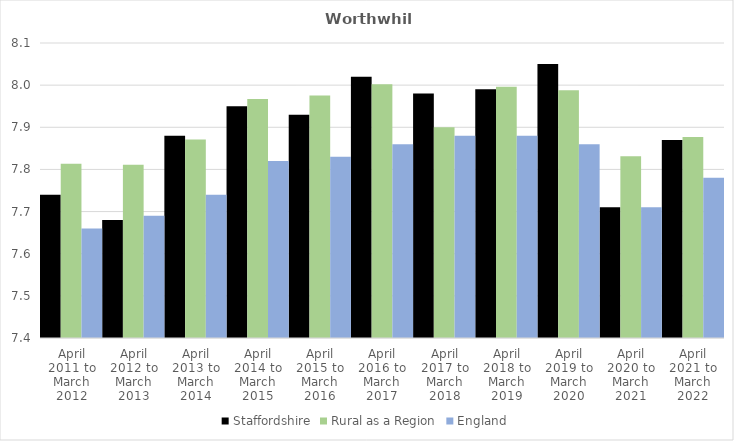
| Category | Staffordshire | Rural as a Region | England |
|---|---|---|---|
| April 2011 to March 2012 | 7.74 | 7.813 | 7.66 |
| April 2012 to March 2013 | 7.68 | 7.811 | 7.69 |
| April 2013 to March 2014 | 7.88 | 7.871 | 7.74 |
| April 2014 to March 2015 | 7.95 | 7.967 | 7.82 |
| April 2015 to March 2016 | 7.93 | 7.975 | 7.83 |
| April 2016 to March 2017 | 8.02 | 8.002 | 7.86 |
| April 2017 to March 2018 | 7.98 | 7.9 | 7.88 |
| April 2018 to March 2019 | 7.99 | 7.996 | 7.88 |
| April 2019 to March 2020 | 8.05 | 7.988 | 7.86 |
| April 2020 to March 2021 | 7.71 | 7.831 | 7.71 |
| April 2021 to March 2022 | 7.87 | 7.877 | 7.78 |